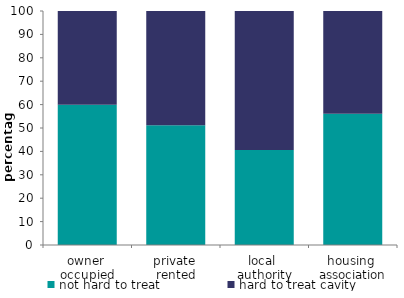
| Category | not hard to treat | hard to treat cavity |
|---|---|---|
| owner 
occupied | 59.887 | 40.113 |
| private 
rented | 51.196 | 48.804 |
| local 
authority | 40.601 | 59.399 |
| housing 
association | 56.093 | 43.907 |